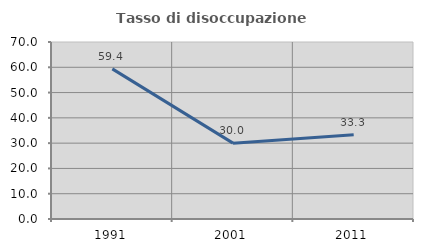
| Category | Tasso di disoccupazione giovanile  |
|---|---|
| 1991.0 | 59.375 |
| 2001.0 | 30 |
| 2011.0 | 33.333 |